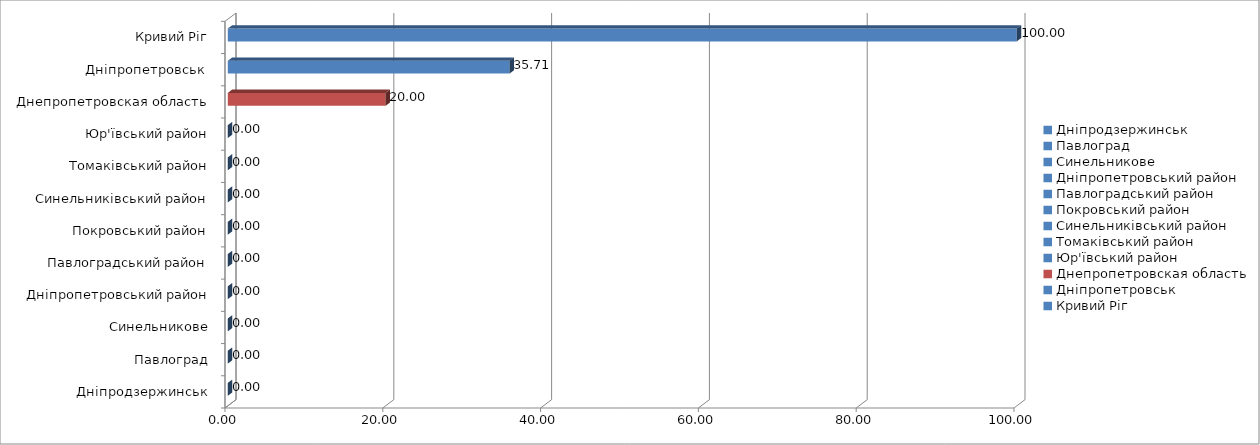
| Category | [160;200) |
|---|---|
| Дніпродзержинськ | 0 |
| Павлоград | 0 |
| Синельникове | 0 |
| Дніпропетровський район | 0 |
| Павлоградський район | 0 |
| Покровський район | 0 |
| Синельниківський район | 0 |
| Томаківський район | 0 |
| Юр'ївський район | 0 |
| Днепропетровская область | 19.998 |
| Дніпропетровськ  | 35.711 |
| Кривий Ріг | 100 |